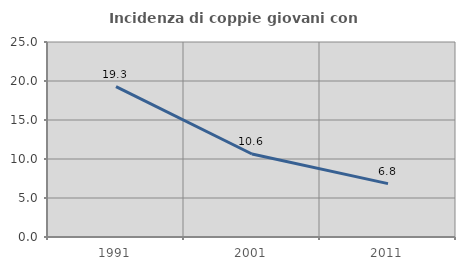
| Category | Incidenza di coppie giovani con figli |
|---|---|
| 1991.0 | 19.285 |
| 2001.0 | 10.644 |
| 2011.0 | 6.839 |